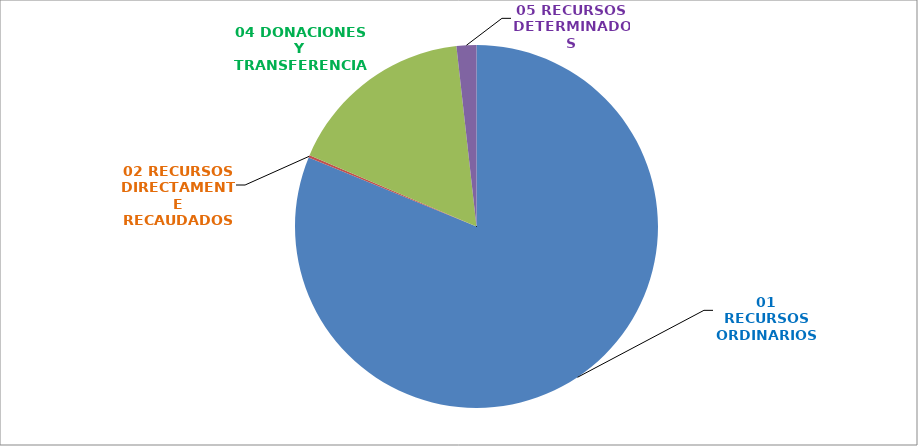
| Category | 445 REGION CAJAMARCA |
|---|---|
| 01 RECURSOS ORDINARIOS | 0.812 |
| 02 RECURSOS DIRECTAMENTE RECAUDADOS | 0.002 |
| 04 DONACIONES Y TRANSFERENCIAS | 0.168 |
| 05 RECURSOS DETERMINADOS | 0.018 |